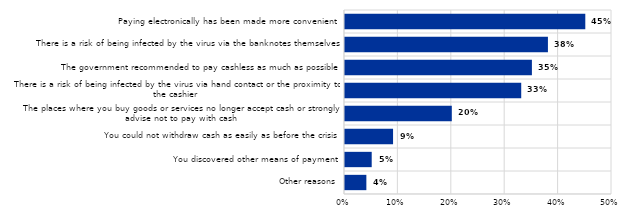
| Category | Series 0 |
|---|---|
| Other reasons | 0.04 |
| You discovered other means of payment | 0.05 |
| You could not withdraw cash as easily as before the crisis | 0.09 |
| The places where you buy goods or services no longer accept cash or strongly advise not to pay with cash | 0.2 |
| There is a risk of being infected by the virus via hand contact or the proximity to the cashier | 0.33 |
| The government recommended to pay cashless as much as possible | 0.35 |
| There is a risk of being infected by the virus via the banknotes themselves | 0.38 |
| Paying electronically has been made more convenient | 0.45 |